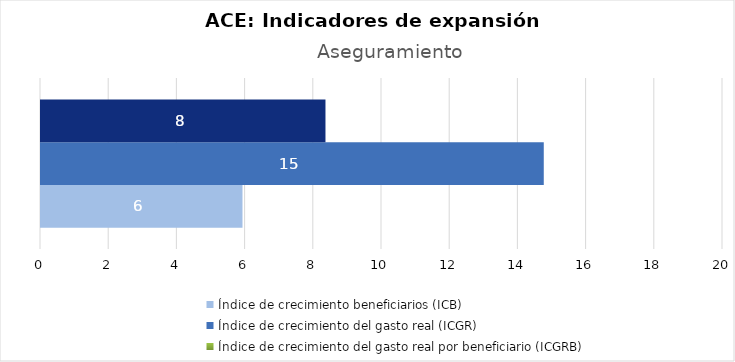
| Category | Índice de crecimiento beneficiarios (ICB)  | Índice de crecimiento del gasto real (ICGR)  | Índice de crecimiento del gasto real por beneficiario (ICGRB)  |
|---|---|---|---|
| Aseguramiento | 5.909 | 14.744 | 8.342 |